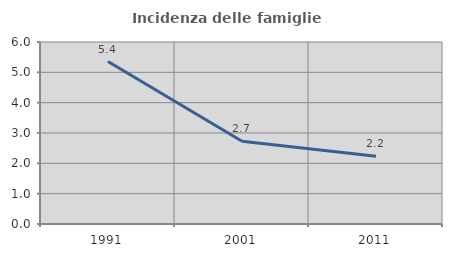
| Category | Incidenza delle famiglie numerose |
|---|---|
| 1991.0 | 5.357 |
| 2001.0 | 2.727 |
| 2011.0 | 2.234 |